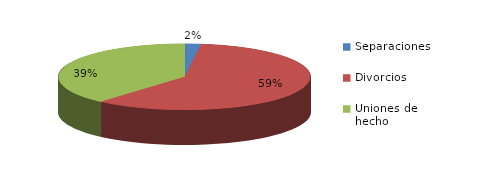
| Category | Series 0 |
|---|---|
| Separaciones | 10 |
| Divorcios | 283 |
| Uniones de hecho | 184 |